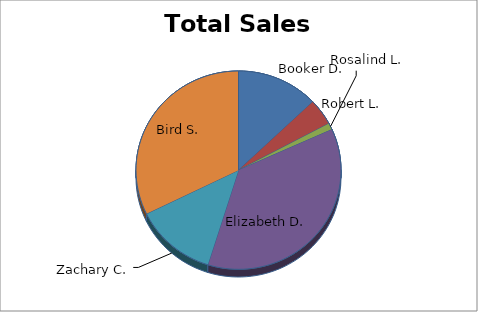
| Category | Quantity |
|---|---|
| Booker D. | 12 |
| Robert L. | 4 |
| Rosalind L. | 1 |
| Elizabeth D. | 34 |
| Zachary C. | 12 |
| Bird S. | 30 |